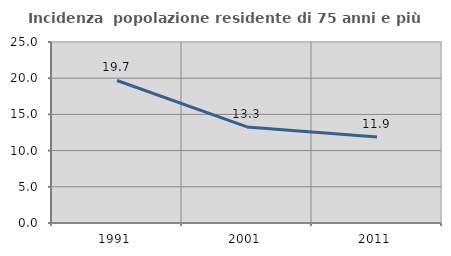
| Category | Incidenza  popolazione residente di 75 anni e più |
|---|---|
| 1991.0 | 19.685 |
| 2001.0 | 13.274 |
| 2011.0 | 11.864 |